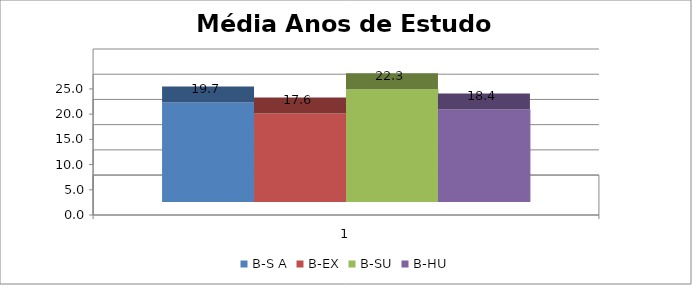
| Category | B-S A | B-EX | B-SU | B-HU |
|---|---|---|---|---|
| 0 | 19.742 | 17.551 | 22.345 | 18.357 |